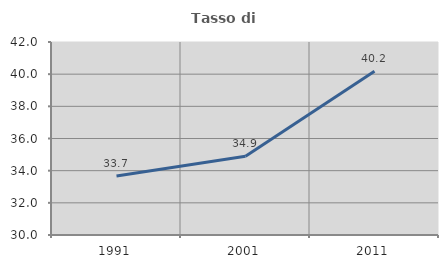
| Category | Tasso di occupazione   |
|---|---|
| 1991.0 | 33.667 |
| 2001.0 | 34.901 |
| 2011.0 | 40.189 |